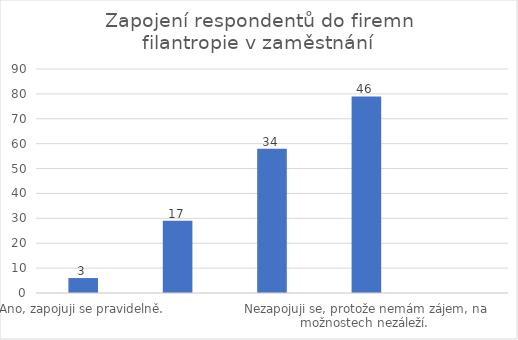
| Category | Počet respondentů |
|---|---|
| Ano, zapojuji se pravidelně. | 6 |
| Ano, zapojuji se příležitostně. | 29 |
| Nezapojuji se, ale kdybych měl příležitost, tak se zapojím.  | 58 |
| Nezapojuji se, protože nemám zájem, na možnostech nezáleží.  | 79 |